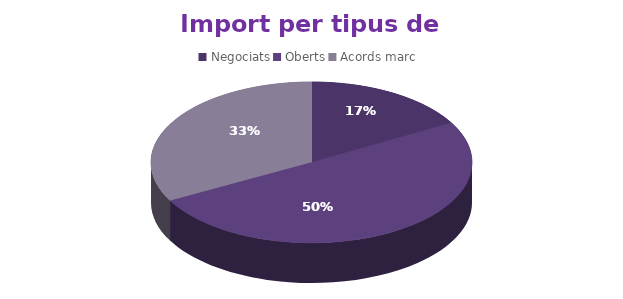
| Category | Series 1 |
|---|---|
| Negociats | 790248 |
| Oberts | 2370365.6 |
| Acords marc | 1548797.86 |